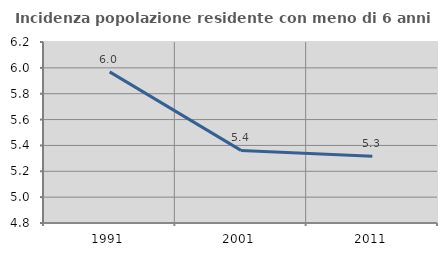
| Category | Incidenza popolazione residente con meno di 6 anni |
|---|---|
| 1991.0 | 5.969 |
| 2001.0 | 5.362 |
| 2011.0 | 5.316 |